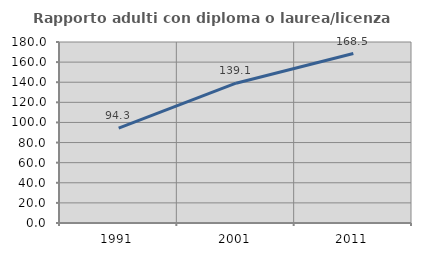
| Category | Rapporto adulti con diploma o laurea/licenza media  |
|---|---|
| 1991.0 | 94.34 |
| 2001.0 | 139.053 |
| 2011.0 | 168.508 |